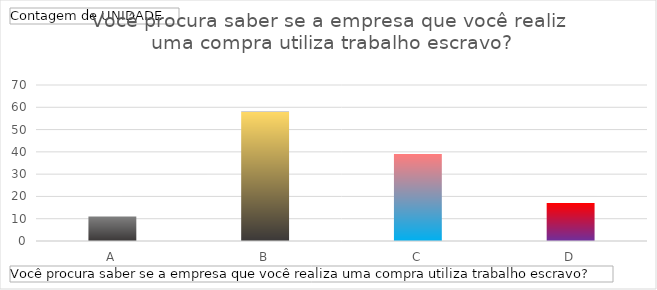
| Category | Total |
|---|---|
| A | 11 |
| B | 58 |
| C | 39 |
| D | 17 |